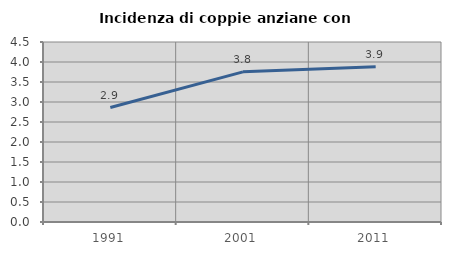
| Category | Incidenza di coppie anziane con figli |
|---|---|
| 1991.0 | 2.861 |
| 2001.0 | 3.754 |
| 2011.0 | 3.879 |